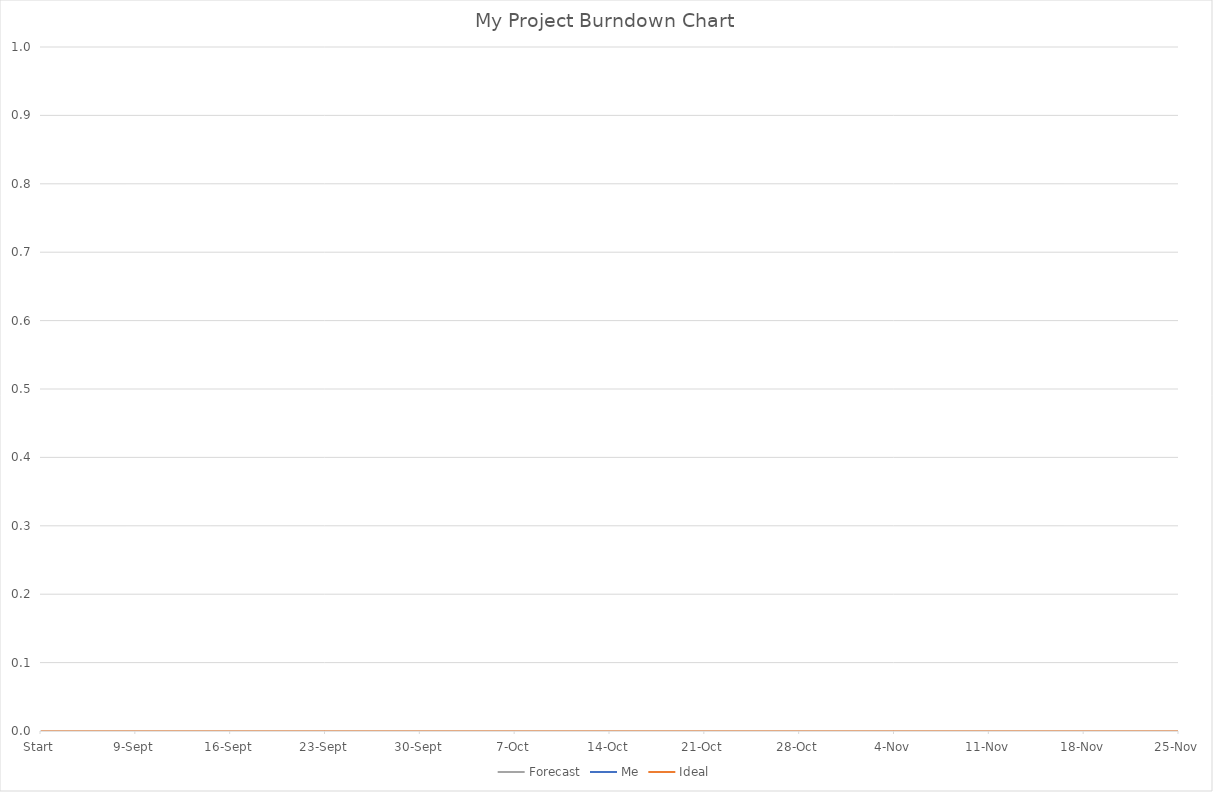
| Category | Forecast | Me | Ideal |
|---|---|---|---|
| Start | 0 | 0 | 0 |
| 9-Sep | 0 | 0 | 0 |
| 16-Sep | 0 | 0 | 0 |
| 23-Sep | 0 | 0 | 0 |
| 30-Sep | 0 | 0 | 0 |
| 7-Oct | 0 | 0 | 0 |
| 14-Oct | 0 | 0 | 0 |
| 21-Oct | 0 | 0 | 0 |
| 28-Oct | 0 | 0 | 0 |
| 4-Nov | 0 | 0 | 0 |
| 11-Nov | 0 | 0 | 0 |
| 18-Nov | 0 | 0 | 0 |
| 25-Nov | 0 | 0 | 0 |